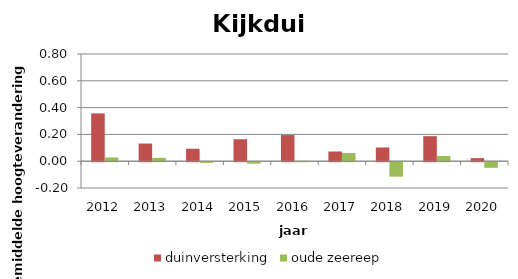
| Category | duinversterking | oude zeereep |
|---|---|---|
| 2012.0 | 0.357 | 0.028 |
| 2013.0 | 0.132 | 0.025 |
| 2014.0 | 0.093 | -0.005 |
| 2015.0 | 0.164 | -0.011 |
| 2016.0 | 0.195 | 0.002 |
| 2017.0 | 0.072 | 0.062 |
| 2018.0 | 0.103 | -0.108 |
| 2019.0 | 0.187 | 0.039 |
| 2020.0 | 0.023 | -0.042 |